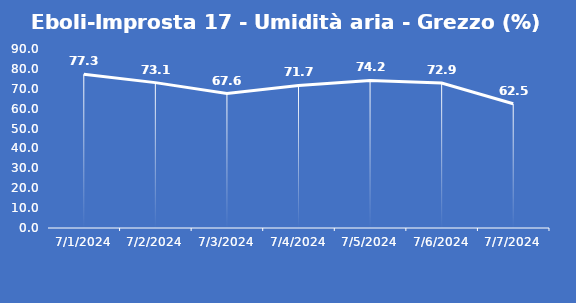
| Category | Eboli-Improsta 17 - Umidità aria - Grezzo (%) |
|---|---|
| 7/1/24 | 77.3 |
| 7/2/24 | 73.1 |
| 7/3/24 | 67.6 |
| 7/4/24 | 71.7 |
| 7/5/24 | 74.2 |
| 7/6/24 | 72.9 |
| 7/7/24 | 62.5 |